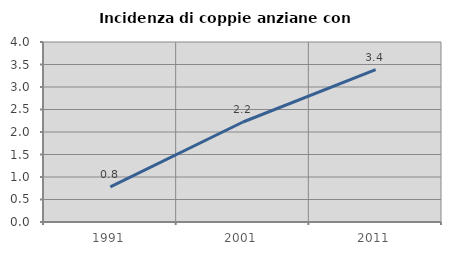
| Category | Incidenza di coppie anziane con figli |
|---|---|
| 1991.0 | 0.78 |
| 2001.0 | 2.222 |
| 2011.0 | 3.388 |